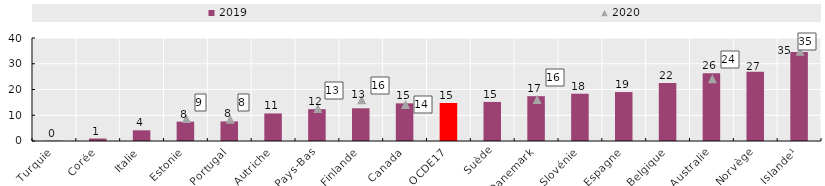
| Category | 2019 |
|---|---|
| Turquie | 0.125 |
| Corée | 0.958 |
| Italie | 4.15 |
| Estonie | 7.515 |
| Portugal | 7.605 |
| Autriche | 10.704 |
| Pays-Bas | 12.353 |
| Finlande | 12.71 |
| Canada | 14.625 |
| OCDE17 | 14.766 |
| Suède | 15.177 |
| Danemark | 17.4 |
| Slovénie | 18.352 |
| Espagne | 18.999 |
| Belgique | 22.482 |
| Australie | 26.33 |
| Norvège | 26.937 |
| Islande¹ | 34.597 |